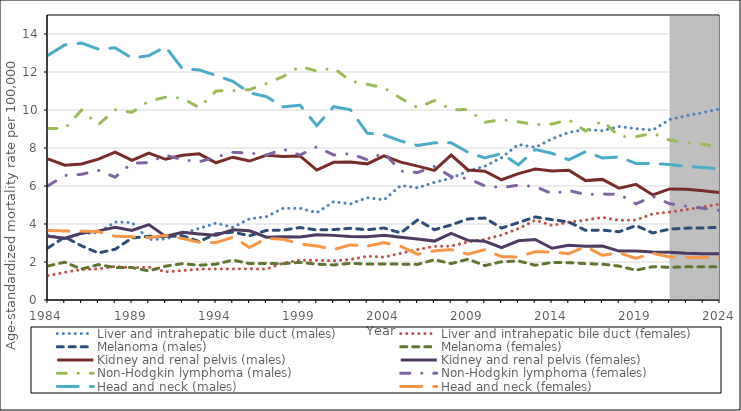
| Category | Liver and intrahepatic bile duct (males) | Liver and intrahepatic bile duct (females) | Melanoma (males) | Melanoma (females) | Kidney and renal pelvis (males) | Kidney and renal pelvis (females) | Non-Hodgkin lymphoma (males) | Non-Hodgkin lymphoma (females) | Head and neck (males) | Head and neck (females) |
|---|---|---|---|---|---|---|---|---|---|---|
| 1984.0 | 3.41 | 1.283 | 2.742 | 1.793 | 7.432 | 3.357 | 9.027 | 6.014 | 12.878 | 3.659 |
| 1985.0 | 3.209 | 1.456 | 3.314 | 1.989 | 7.097 | 3.255 | 9.016 | 6.553 | 13.427 | 3.632 |
| 1986.0 | 3.497 | 1.606 | 2.849 | 1.626 | 7.162 | 3.514 | 10 | 6.616 | 13.521 | 3.626 |
| 1987.0 | 3.547 | 1.635 | 2.474 | 1.863 | 7.412 | 3.637 | 9.226 | 6.82 | 13.205 | 3.599 |
| 1988.0 | 4.105 | 1.771 | 2.672 | 1.71 | 7.786 | 3.83 | 10.017 | 6.465 | 13.273 | 3.354 |
| 1989.0 | 4.074 | 1.7 | 3.264 | 1.709 | 7.348 | 3.656 | 9.876 | 7.202 | 12.731 | 3.334 |
| 1990.0 | 3.184 | 1.725 | 3.351 | 1.532 | 7.735 | 3.967 | 10.466 | 7.227 | 12.86 | 3.279 |
| 1991.0 | 3.208 | 1.485 | 3.343 | 1.781 | 7.406 | 3.349 | 10.674 | 7.621 | 13.324 | 3.404 |
| 1992.0 | 3.491 | 1.548 | 3.384 | 1.91 | 7.62 | 3.568 | 10.623 | 7.385 | 12.169 | 3.24 |
| 1993.0 | 3.769 | 1.626 | 3.076 | 1.831 | 7.695 | 3.479 | 10.123 | 7.274 | 12.109 | 3.038 |
| 1994.0 | 4.047 | 1.638 | 3.482 | 1.886 | 7.222 | 3.408 | 11.005 | 7.522 | 11.824 | 3.022 |
| 1995.0 | 3.826 | 1.638 | 3.572 | 2.1 | 7.516 | 3.699 | 11.015 | 7.772 | 11.509 | 3.302 |
| 1996.0 | 4.276 | 1.644 | 3.38 | 1.916 | 7.313 | 3.642 | 11.073 | 7.739 | 10.905 | 2.764 |
| 1997.0 | 4.386 | 1.623 | 3.661 | 1.921 | 7.624 | 3.303 | 11.395 | 7.626 | 10.704 | 3.245 |
| 1998.0 | 4.825 | 1.945 | 3.677 | 1.91 | 7.552 | 3.329 | 11.763 | 7.944 | 10.164 | 3.197 |
| 1999.0 | 4.831 | 2.09 | 3.811 | 1.982 | 7.582 | 3.312 | 12.295 | 7.627 | 10.252 | 2.949 |
| 2000.0 | 4.591 | 2.089 | 3.687 | 1.884 | 6.839 | 3.437 | 12.045 | 8.066 | 9.179 | 2.84 |
| 2001.0 | 5.174 | 2.059 | 3.707 | 1.846 | 7.248 | 3.401 | 12.214 | 7.631 | 10.173 | 2.659 |
| 2002.0 | 5.057 | 2.133 | 3.775 | 1.932 | 7.257 | 3.336 | 11.526 | 7.706 | 10.016 | 2.9 |
| 2003.0 | 5.385 | 2.303 | 3.698 | 1.89 | 7.166 | 3.331 | 11.353 | 7.38 | 8.783 | 2.833 |
| 2004.0 | 5.27 | 2.259 | 3.79 | 1.9 | 7.581 | 3.408 | 11.167 | 7.744 | 8.691 | 3.016 |
| 2005.0 | 6.028 | 2.46 | 3.529 | 1.885 | 7.253 | 3.298 | 10.614 | 6.783 | 8.367 | 2.823 |
| 2006.0 | 5.904 | 2.653 | 4.215 | 1.874 | 7.047 | 3.206 | 10.123 | 6.708 | 8.133 | 2.41 |
| 2007.0 | 6.194 | 2.823 | 3.698 | 2.12 | 6.822 | 3.1 | 10.497 | 7.034 | 8.272 | 2.589 |
| 2008.0 | 6.413 | 2.836 | 3.95 | 1.914 | 7.629 | 3.506 | 10.018 | 6.495 | 8.272 | 2.652 |
| 2009.0 | 6.787 | 3.059 | 4.265 | 2.15 | 6.844 | 3.138 | 10.02 | 6.391 | 7.772 | 2.412 |
| 2010.0 | 7.039 | 3.189 | 4.314 | 1.811 | 6.783 | 3.093 | 9.351 | 6.007 | 7.479 | 2.65 |
| 2011.0 | 7.492 | 3.421 | 3.786 | 2.013 | 6.329 | 2.755 | 9.498 | 5.915 | 7.709 | 2.279 |
| 2012.0 | 8.183 | 3.756 | 4.076 | 2.056 | 6.653 | 3.118 | 9.377 | 6.042 | 7.115 | 2.265 |
| 2013.0 | 8.032 | 4.198 | 4.371 | 1.829 | 6.892 | 3.182 | 9.232 | 5.974 | 7.92 | 2.54 |
| 2014.0 | 8.478 | 3.926 | 4.227 | 1.977 | 6.788 | 2.722 | 9.258 | 5.598 | 7.722 | 2.525 |
| 2015.0 | 8.823 | 4.094 | 4.11 | 1.965 | 6.825 | 2.877 | 9.486 | 5.761 | 7.38 | 2.439 |
| 2016.0 | 8.974 | 4.204 | 3.665 | 1.912 | 6.284 | 2.833 | 8.889 | 5.556 | 7.809 | 2.81 |
| 2017.0 | 8.906 | 4.35 | 3.677 | 1.888 | 6.347 | 2.839 | 9.439 | 5.573 | 7.474 | 2.353 |
| 2018.0 | 9.128 | 4.193 | 3.593 | 1.781 | 5.884 | 2.576 | 8.607 | 5.57 | 7.528 | 2.485 |
| 2019.0 | 9.016 | 4.213 | 3.916 | 1.57 | 6.085 | 2.577 | 8.596 | 5.058 | 7.189 | 2.193 |
| 2020.0 | 8.941 | 4.534 | 3.527 | 1.756 | 5.532 | 2.526 | 8.773 | 5.452 | 7.188 | 2.454 |
| 2021.0 | 9.497 | 4.628 | 3.733 | 1.721 | 5.845 | 2.512 | 8.415 | 5.067 | 7.131 | 2.267 |
| 2022.0 | 9.694 | 4.758 | 3.781 | 1.745 | 5.832 | 2.464 | 8.295 | 4.937 | 7.026 | 2.243 |
| 2023.0 | 9.866 | 4.906 | 3.795 | 1.743 | 5.754 | 2.436 | 8.196 | 4.826 | 6.975 | 2.235 |
| 2024.0 | 10.059 | 5.047 | 3.825 | 1.748 | 5.657 | 2.438 | 8.055 | 4.719 | 6.898 | 2.227 |